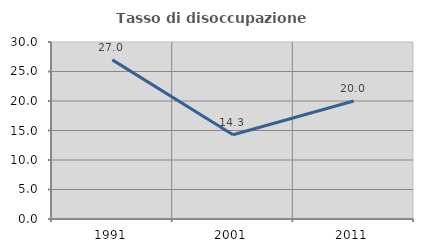
| Category | Tasso di disoccupazione giovanile  |
|---|---|
| 1991.0 | 26.974 |
| 2001.0 | 14.286 |
| 2011.0 | 20 |